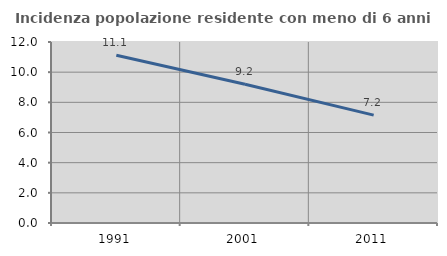
| Category | Incidenza popolazione residente con meno di 6 anni |
|---|---|
| 1991.0 | 11.117 |
| 2001.0 | 9.196 |
| 2011.0 | 7.151 |